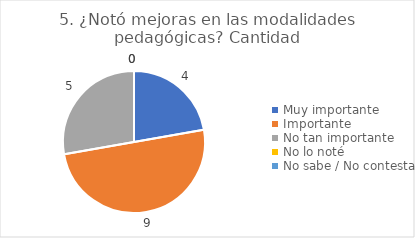
| Category | 5. ¿Notó mejoras en las modalidades pedagógicas? |
|---|---|
| Muy importante  | 0.222 |
| Importante  | 0.5 |
| No tan importante  | 0.278 |
| No lo noté  | 0 |
| No sabe / No contesta | 0 |